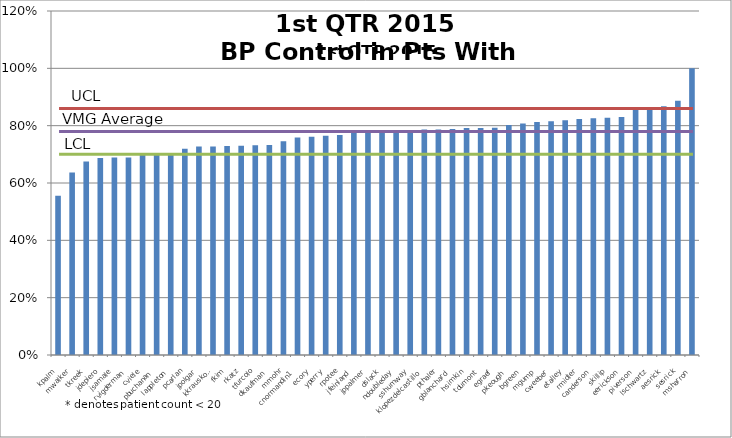
| Category | Series 0 |
|---|---|
| kpalm | 0.556 |
| mwalker | 0.636 |
| tkreek | 0.675 |
| jdepiero | 0.688 |
| jsamale | 0.689 |
| rvigderman | 0.689 |
| cviele | 0.699 |
| pbuchanan | 0.703 |
| lappleton | 0.705 |
| pcarlan | 0.72 |
| jpolgar | 0.727 |
| kkrauskopf | 0.727 |
| fkim | 0.729 |
| rkatz | 0.73 |
| tfurcolo | 0.731 |
| dkaufman | 0.732 |
| mmohr | 0.746 |
| cnormandin1 | 0.758 |
| ecory | 0.761 |
| yperry | 0.765 |
| rpotee | 0.768 |
| jfeinland | 0.775 |
| jppalmer | 0.78 |
| dslack | 0.782 |
| ndoubleday | 0.783 |
| sshumway | 0.783 |
| klopezdelcastillo | 0.787 |
| pthaler | 0.787 |
| gblanchard | 0.788 |
| hsimkin | 0.792 |
| tdumont | 0.792 |
| egraef | 0.792 |
| pkeough | 0.802 |
| bgreen | 0.807 |
| mgump | 0.813 |
| cweeber | 0.816 |
| etalley | 0.819 |
| rmidler | 0.823 |
| canderson | 0.825 |
| skillip | 0.828 |
| eerickson | 0.83 |
| piverson | 0.858 |
| lschwartz | 0.861 |
| aesrick | 0.868 |
| sesrick | 0.887 |
| msharron | 1 |